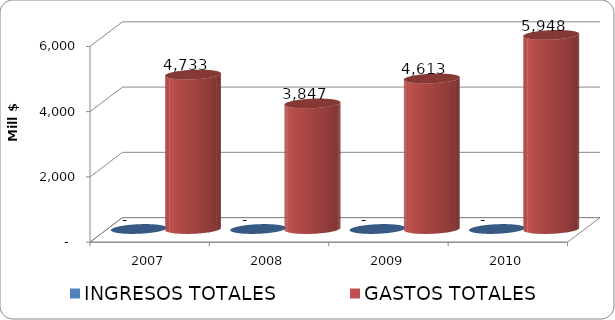
| Category | INGRESOS TOTALES | GASTOS TOTALES |
|---|---|---|
| 2007 | 0 | 4732.737 |
| 2008 | 0 | 3847.441 |
| 2009 | 0 | 4612.943 |
| 2010 | 0 | 5947.75 |